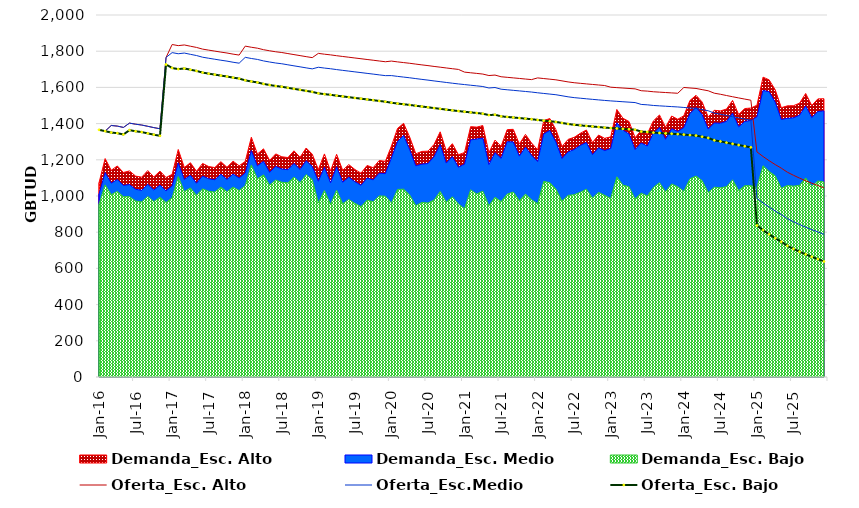
| Category | Oferta_Esc. Alto | Oferta_Esc.Medio | Oferta_Esc. Bajo |
|---|---|---|---|
| 2016-01-01 | 1365.693 | 1365.693 | 1365.693 |
| 2016-02-01 | 1358.267 | 1358.267 | 1358.267 |
| 2016-03-01 | 1389.549 | 1389.549 | 1350.549 |
| 2016-04-01 | 1386.158 | 1386.158 | 1347.158 |
| 2016-05-01 | 1378.854 | 1378.854 | 1339.854 |
| 2016-06-01 | 1402.695 | 1402.695 | 1363.695 |
| 2016-07-01 | 1396.741 | 1396.741 | 1357.741 |
| 2016-08-01 | 1392.09 | 1392.09 | 1353.09 |
| 2016-09-01 | 1385.079 | 1385.079 | 1346.079 |
| 2016-10-01 | 1377.836 | 1377.836 | 1338.836 |
| 2016-11-01 | 1371.486 | 1371.486 | 1332.486 |
| 2016-12-01 | 1765.471 | 1765.471 | 1726.471 |
| 2017-01-01 | 1836.94 | 1792.163 | 1707.163 |
| 2017-02-01 | 1830.761 | 1785.984 | 1700.984 |
| 2017-03-01 | 1834.495 | 1789.718 | 1704.718 |
| 2017-04-01 | 1827.476 | 1782.699 | 1697.699 |
| 2017-05-01 | 1820.829 | 1776.052 | 1691.052 |
| 2017-06-01 | 1811.545 | 1766.768 | 1681.768 |
| 2017-07-01 | 1805.869 | 1761.092 | 1676.092 |
| 2017-08-01 | 1800.431 | 1755.654 | 1670.654 |
| 2017-09-01 | 1795.015 | 1750.238 | 1665.238 |
| 2017-10-01 | 1790.007 | 1745.23 | 1660.23 |
| 2017-11-01 | 1783.771 | 1738.994 | 1653.994 |
| 2017-12-01 | 1778.62 | 1733.843 | 1648.843 |
| 2018-01-01 | 1828.112 | 1766.068 | 1639.068 |
| 2018-02-01 | 1821.762 | 1759.718 | 1632.718 |
| 2018-03-01 | 1816.609 | 1754.565 | 1627.565 |
| 2018-04-01 | 1808.333 | 1746.289 | 1619.289 |
| 2018-05-01 | 1802.313 | 1740.269 | 1613.269 |
| 2018-06-01 | 1796.834 | 1734.79 | 1607.79 |
| 2018-07-01 | 1792.694 | 1730.65 | 1603.65 |
| 2018-08-01 | 1786.915 | 1724.871 | 1597.871 |
| 2018-09-01 | 1781.185 | 1719.141 | 1592.141 |
| 2018-10-01 | 1775.631 | 1713.587 | 1586.587 |
| 2018-11-01 | 1769.928 | 1707.884 | 1580.884 |
| 2018-12-01 | 1764.436 | 1702.392 | 1575.392 |
| 2019-01-01 | 1787.947 | 1711.264 | 1567.264 |
| 2019-02-01 | 1783.446 | 1706.763 | 1562.763 |
| 2019-03-01 | 1779.75 | 1703.067 | 1559.067 |
| 2019-04-01 | 1775.099 | 1698.416 | 1554.416 |
| 2019-05-01 | 1770.816 | 1694.133 | 1550.133 |
| 2019-06-01 | 1766.724 | 1690.041 | 1546.041 |
| 2019-07-01 | 1762.462 | 1685.779 | 1541.779 |
| 2019-08-01 | 1758.455 | 1681.772 | 1537.772 |
| 2019-09-01 | 1754.195 | 1677.512 | 1533.512 |
| 2019-10-01 | 1750.141 | 1673.458 | 1529.458 |
| 2019-11-01 | 1745.858 | 1669.175 | 1525.175 |
| 2019-12-01 | 1741.717 | 1665.034 | 1521.034 |
| 2020-01-01 | 1745.404 | 1665.288 | 1515.288 |
| 2020-02-01 | 1740.984 | 1660.868 | 1510.868 |
| 2020-03-01 | 1737.124 | 1657.008 | 1507.008 |
| 2020-04-01 | 1733.179 | 1653.063 | 1503.063 |
| 2020-05-01 | 1728.753 | 1648.637 | 1498.637 |
| 2020-06-01 | 1724.378 | 1644.262 | 1494.262 |
| 2020-07-01 | 1720.333 | 1640.217 | 1490.217 |
| 2020-08-01 | 1715.857 | 1635.741 | 1485.741 |
| 2020-09-01 | 1711.691 | 1631.575 | 1481.575 |
| 2020-10-01 | 1707.383 | 1627.267 | 1477.267 |
| 2020-11-01 | 1703.286 | 1623.17 | 1473.17 |
| 2020-12-01 | 1699.308 | 1619.192 | 1469.192 |
| 2021-01-01 | 1684.393 | 1615.62 | 1465.62 |
| 2021-02-01 | 1680.769 | 1611.996 | 1461.996 |
| 2021-03-01 | 1677.337 | 1608.564 | 1458.564 |
| 2021-04-01 | 1673.649 | 1604.876 | 1454.876 |
| 2021-05-01 | 1665.564 | 1596.791 | 1446.791 |
| 2021-06-01 | 1668.134 | 1599.361 | 1449.361 |
| 2021-07-01 | 1658.815 | 1590.042 | 1440.042 |
| 2021-08-01 | 1655.656 | 1586.883 | 1436.883 |
| 2021-09-01 | 1652.581 | 1583.808 | 1433.808 |
| 2021-10-01 | 1649.452 | 1580.679 | 1430.679 |
| 2021-11-01 | 1646.228 | 1577.455 | 1427.455 |
| 2021-12-01 | 1643.072 | 1574.299 | 1424.299 |
| 2022-01-01 | 1652.536 | 1570.201 | 1420.201 |
| 2022-02-01 | 1648.898 | 1566.563 | 1416.563 |
| 2022-03-01 | 1645.414 | 1563.079 | 1413.079 |
| 2022-04-01 | 1641.883 | 1559.548 | 1409.548 |
| 2022-05-01 | 1636.062 | 1553.727 | 1403.727 |
| 2022-06-01 | 1630.29 | 1547.955 | 1397.955 |
| 2022-07-01 | 1625.821 | 1543.486 | 1393.486 |
| 2022-08-01 | 1622.575 | 1540.24 | 1390.24 |
| 2022-09-01 | 1619.411 | 1537.076 | 1387.076 |
| 2022-10-01 | 1616.327 | 1533.992 | 1383.992 |
| 2022-11-01 | 1613.322 | 1530.987 | 1380.987 |
| 2022-12-01 | 1610.334 | 1527.999 | 1377.999 |
| 2023-01-01 | 1601.136 | 1525.464 | 1375.464 |
| 2023-02-01 | 1598.736 | 1523.064 | 1373.064 |
| 2023-03-01 | 1596.451 | 1520.779 | 1370.779 |
| 2023-04-01 | 1594.155 | 1518.483 | 1368.483 |
| 2023-05-01 | 1591.872 | 1516.2 | 1366.2 |
| 2023-06-01 | 1581.616 | 1505.944 | 1355.944 |
| 2023-07-01 | 1579.424 | 1503.752 | 1353.752 |
| 2023-08-01 | 1575.904 | 1500.232 | 1350.232 |
| 2023-09-01 | 1573.747 | 1498.075 | 1348.075 |
| 2023-10-01 | 1571.654 | 1495.982 | 1345.982 |
| 2023-11-01 | 1569.596 | 1493.924 | 1343.924 |
| 2023-12-01 | 1567.567 | 1491.895 | 1341.895 |
| 2024-01-01 | 1599.535 | 1489.198 | 1339.198 |
| 2024-02-01 | 1596.811 | 1486.474 | 1336.474 |
| 2024-03-01 | 1594.186 | 1483.849 | 1333.849 |
| 2024-04-01 | 1587.676 | 1477.339 | 1327.339 |
| 2024-05-01 | 1581.375 | 1471.038 | 1321.038 |
| 2024-06-01 | 1568.014 | 1457.677 | 1307.677 |
| 2024-07-01 | 1562.073 | 1451.736 | 1301.736 |
| 2024-08-01 | 1555.12 | 1444.783 | 1294.783 |
| 2024-09-01 | 1548.376 | 1438.039 | 1288.039 |
| 2024-10-01 | 1541.817 | 1431.48 | 1281.48 |
| 2024-11-01 | 1535.407 | 1425.07 | 1275.07 |
| 2024-12-01 | 1529.192 | 1418.855 | 1268.855 |
| 2025-01-01 | 1243.568 | 987.044 | 837.044 |
| 2025-02-01 | 1218.258 | 961.734 | 811.734 |
| 2025-03-01 | 1195.01 | 938.486 | 788.486 |
| 2025-04-01 | 1173.532 | 917.008 | 767.008 |
| 2025-05-01 | 1153.715 | 897.191 | 747.191 |
| 2025-06-01 | 1131.329 | 874.805 | 724.805 |
| 2025-07-01 | 1114.418 | 857.894 | 707.894 |
| 2025-08-01 | 1098.736 | 842.212 | 692.212 |
| 2025-09-01 | 1084.149 | 827.625 | 677.625 |
| 2025-10-01 | 1070.636 | 814.112 | 664.112 |
| 2025-11-01 | 1058.065 | 801.541 | 651.541 |
| 2025-12-01 | 1044.884 | 788.36 | 638.36 |